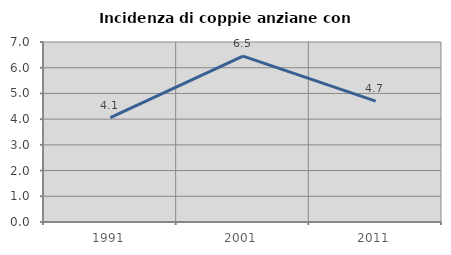
| Category | Incidenza di coppie anziane con figli |
|---|---|
| 1991.0 | 4.06 |
| 2001.0 | 6.452 |
| 2011.0 | 4.701 |